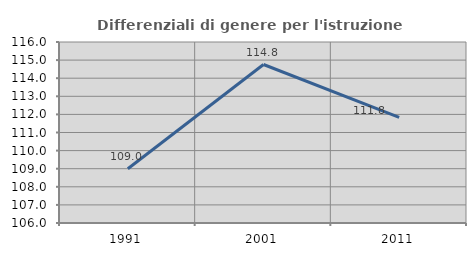
| Category | Differenziali di genere per l'istruzione superiore |
|---|---|
| 1991.0 | 109.001 |
| 2001.0 | 114.757 |
| 2011.0 | 111.838 |